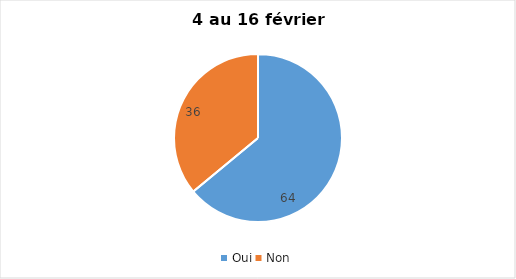
| Category | Series 0 |
|---|---|
| Oui | 64 |
| Non | 36 |